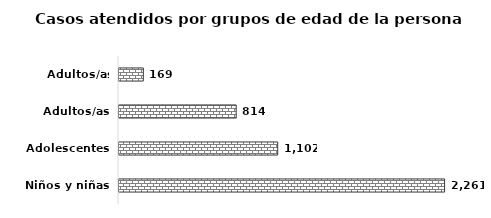
| Category | Series 0 |
|---|---|
| Niños y niñas | 2261 |
| Adolescentes | 1102 |
| Adultos/as | 814 |
| Adultos/as mayores | 169 |